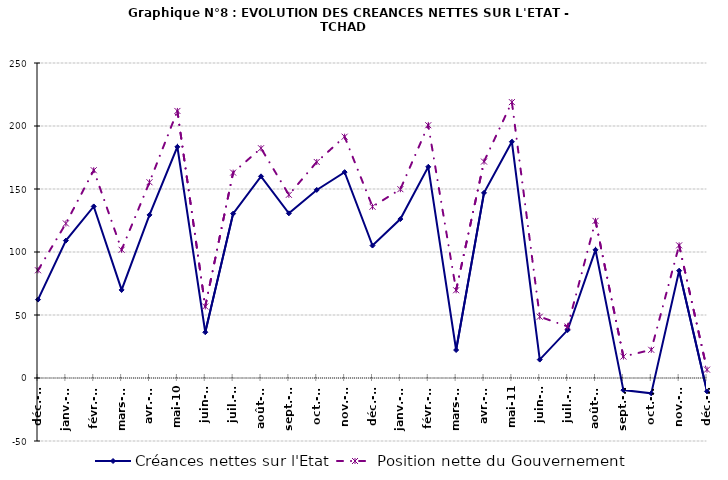
| Category | Créances nettes sur l'Etat | Position nette du Gouvernement |
|---|---|---|
| 2009-12-04 | 62222 | 85488 |
| 2010-01-04 | 109051 | 122654 |
| 2010-02-04 | 136172 | 164881 |
| 2010-03-04 | 69893 | 101770 |
| 2010-04-04 | 129428 | 155350 |
| 2010-05-04 | 183460 | 211942 |
| 2010-06-04 | 36324 | 56757 |
| 2010-07-04 | 130453 | 163009 |
| 2010-08-04 | 160052 | 182344 |
| 2010-09-04 | 130691 | 145398 |
| 2010-10-04 | 149256 | 171445 |
| 2010-11-04 | 163387 | 191506 |
| 2010-12-04 | 105113 | 135913 |
| 2011-01-01 | 126137 | 149849 |
| 2011-02-01 | 167596 | 200618 |
| 2011-03-01 | 22207 | 69637 |
| 2011-04-01 | 146940 | 171767 |
| 2011-05-01 | 187500 | 218952 |
| 2011-06-01 | 14608 | 48639 |
| 2011-07-01 | 38024 | 40869 |
| 2011-08-01 | 101712 | 124688 |
| 2011-09-01 | -9614 | 17013 |
| 2011-10-01 | -12181 | 22376 |
| 2011-11-01 | 85167 | 105275 |
| 2011-12-01 | -10608 | 6645 |